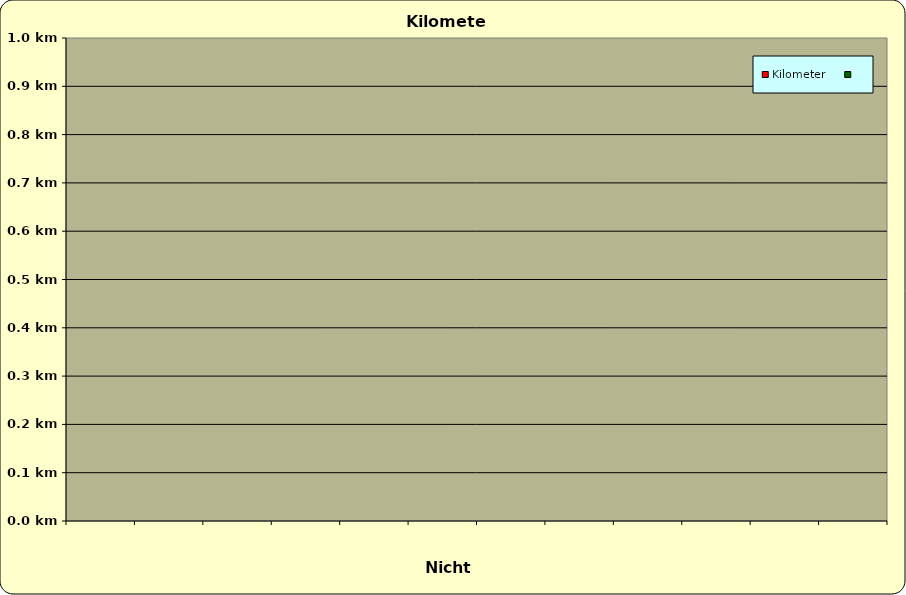
| Category | Kilometer | Series 1 |
|---|---|---|
| 0 | 0 | 0 |
| 1 | 0 | 0 |
| 2 | 0 | 0 |
| 3 | 0 | 0 |
| 4 | 0 | 0 |
| 5 | 0 | 0 |
| 6 | 0 | 0 |
| 7 | 0 | 0 |
| 8 | 0 | 0 |
| 9 | 0 | 0 |
| 10 | 0 | 0 |
| 11 | 0 | 0 |